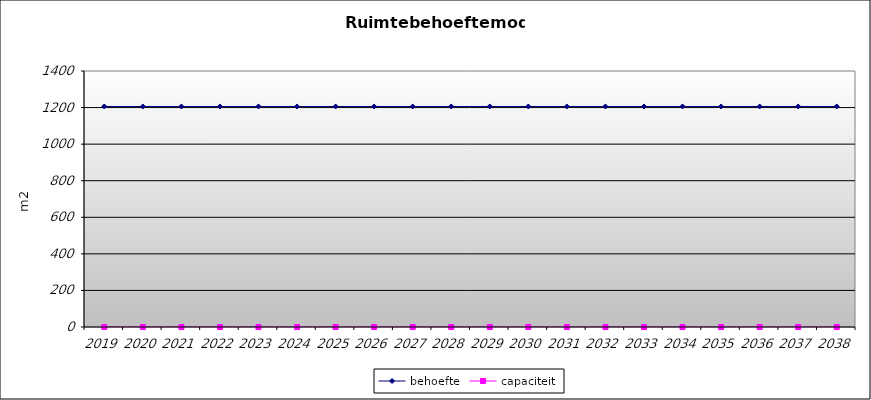
| Category | behoefte | capaciteit |
|---|---|---|
| 2019.0 | 1206 | 0 |
| 2020.0 | 1206 | 0 |
| 2021.0 | 1206 | 0 |
| 2022.0 | 1206 | 0 |
| 2023.0 | 1206 | 0 |
| 2024.0 | 1206 | 0 |
| 2025.0 | 1206 | 0 |
| 2026.0 | 1206 | 0 |
| 2027.0 | 1206 | 0 |
| 2028.0 | 1206 | 0 |
| 2029.0 | 1206 | 0 |
| 2030.0 | 1206 | 0 |
| 2031.0 | 1206 | 0 |
| 2032.0 | 1206 | 0 |
| 2033.0 | 1206 | 0 |
| 2034.0 | 1206 | 0 |
| 2035.0 | 1206 | 0 |
| 2036.0 | 1206 | 0 |
| 2037.0 | 1206 | 0 |
| 2038.0 | 1206 | 0 |